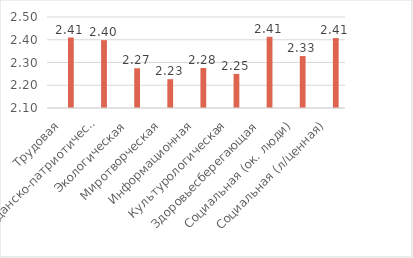
| Category | Series 0 | Series 1 | Series 2 |
|---|---|---|---|
| Трудовая |  |  | 2.41 |
| Гражданско-патриотическая |  |  | 2.398 |
| Экологическая |  |  | 2.275 |
| Миротворческая |  |  | 2.227 |
| Информационная |  |  | 2.276 |
| Культурологическая |  |  | 2.25 |
| Здоровьесберегающая |  |  | 2.413 |
| Социальная (ок. люди) |  |  | 2.328 |
| Социальная (л/ценная) |  |  | 2.407 |